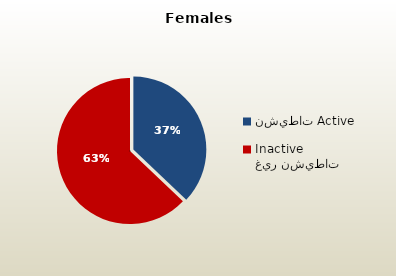
| Category | الاناث القطريات  Qatari Females |
|---|---|
| نشيطات Active | 40821 |
| غير نشيطات Inactive | 69215 |